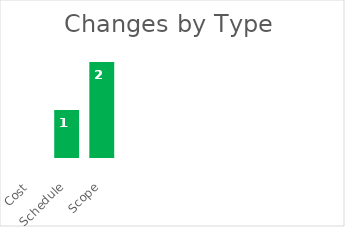
| Category | Cost |
|---|---|
| Cost | 0 |
| Schedule | 1 |
| Scope | 2 |